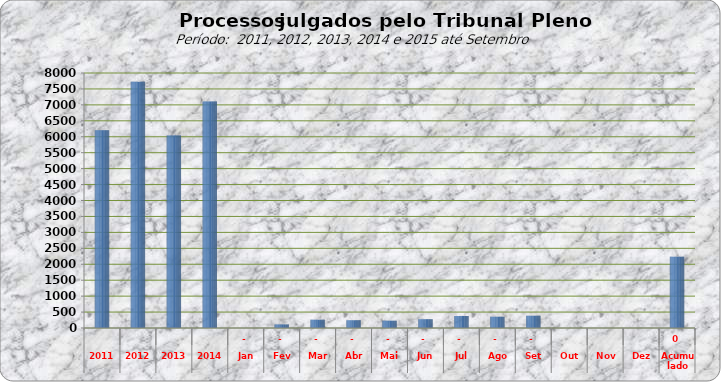
| Category | 6205 7722 6043  7.108  0 113 258 243 231 277 379 354 384 0 0 0 |
|---|---|
| 2011 | 6205 |
| 2012 | 7722 |
| 2013 | 6043 |
| 2014 | 7108 |
| Jan | 0 |
| Fev | 113 |
| Mar | 258 |
| Abr | 243 |
| Mai | 231 |
| Jun | 277 |
| Jul | 379 |
| Ago | 354 |
| Set | 384 |
| Out | 0 |
| Nov | 0 |
| Dez | 0 |
| Acumulado | 2239 |